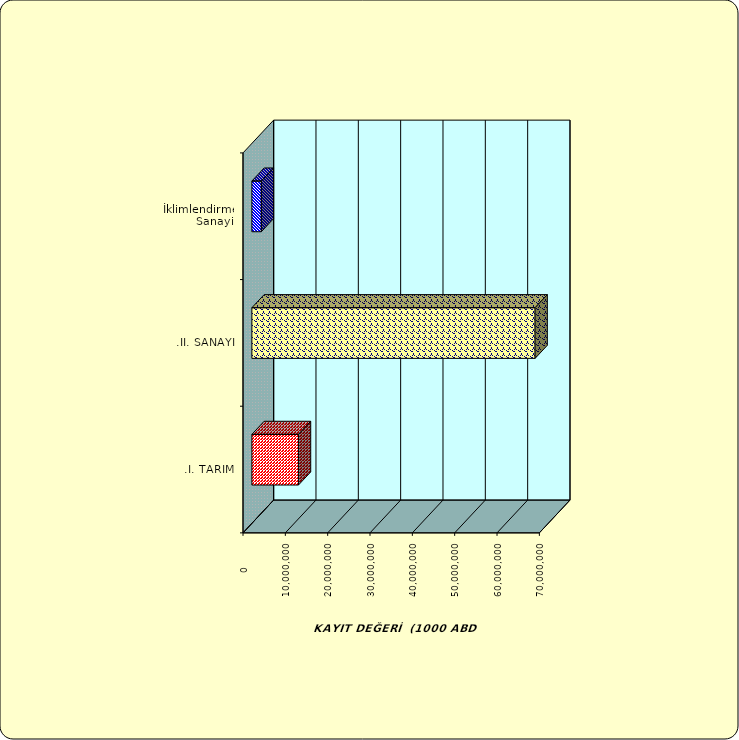
| Category | Series 0 |
|---|---|
| .I. TARIM | 11005571.254 |
| .II. SANAYİ | 66897567.307 |
|  İklimlendirme Sanayii | 2231162.239 |